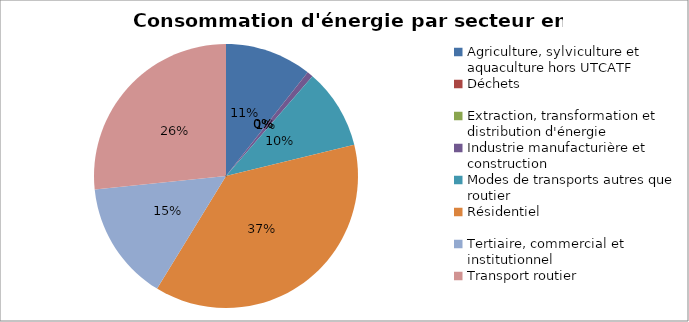
| Category | Series 0 |
|---|---|
| Agriculture, sylviculture et aquaculture hors UTCATF | 24760.722 |
| Déchets | 0 |
| Extraction, transformation et distribution d'énergie | 0 |
| Industrie manufacturière et construction | 1737.691 |
| Modes de transports autres que routier | 22930.362 |
| Résidentiel | 87480.271 |
| Tertiaire, commercial et institutionnel | 34123.064 |
| Transport routier | 62043.959 |